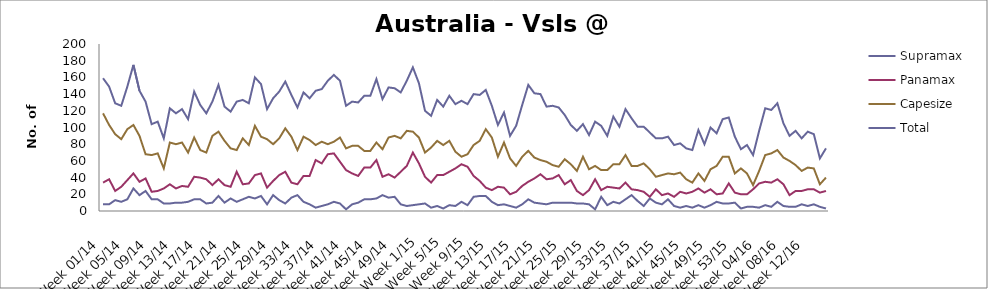
| Category | Supramax | Panamax | Capesize | Total |
|---|---|---|---|---|
| Week 01/14 | 8 | 34 | 117 | 159 |
| Week 02/14 | 8 | 38 | 103 | 149 |
| Week 03/14 | 13 | 24 | 92 | 129 |
| Week 04/14 | 11 | 29 | 86 | 126 |
| Week 05/14 | 14 | 37 | 98 | 149 |
| Week 06/14 | 27 | 45 | 103 | 175 |
| Week 07/14 | 19 | 35 | 90 | 144 |
| Week 08/14 | 24 | 39 | 68 | 131 |
| Week 09/14 | 14 | 23 | 67 | 104 |
| Week 10/14 | 14 | 24 | 69 | 107 |
| Week 11/14 | 9 | 27 | 51 | 87 |
| Week 12/14 | 9 | 32 | 82 | 123 |
| Week 13/14 | 10 | 27 | 80 | 117 |
| Week 14/14 | 10 | 30 | 82 | 122 |
| Week 15/14 | 11 | 29 | 70 | 110 |
| Week 16/14 | 14 | 41 | 88 | 143 |
| Week 17/14 | 14 | 40 | 73 | 127 |
| Week 18/14 | 9 | 38 | 70 | 117 |
| Week 19/14 | 10 | 31 | 90 | 131 |
| Week 20/14 | 18 | 38 | 95 | 151 |
| Week 21/14 | 10 | 31 | 84 | 125 |
| Week 22/14 | 15 | 29 | 75 | 119 |
| Week 23/14 | 11 | 47 | 73 | 131 |
| Week 24/14 | 14 | 32 | 87 | 133 |
| Week 25/14 | 17 | 33 | 79 | 129 |
| Week 26/14 | 15 | 43 | 102 | 160 |
| Week 27/14 | 18 | 45 | 89 | 152 |
| Week 28/14 | 8 | 28 | 86 | 122 |
| Week 29/14 | 19 | 36 | 80 | 135 |
| Week 30/14 | 13 | 43 | 87 | 143 |
| Week 31/14 | 9 | 47 | 99 | 155 |
| Week 32/14 | 16 | 34 | 89 | 139 |
| Week 33/14 | 19 | 32 | 73 | 124 |
| Week 34/14 | 11 | 42 | 89 | 142 |
| Week 35/14 | 8 | 42 | 85 | 135 |
| Week 36/14 | 4 | 61 | 79 | 144 |
| Week 37/14 | 6 | 57 | 83 | 146 |
| Week 38/14 | 8 | 68 | 80 | 156 |
| Week 39/14 | 11 | 69 | 83 | 163 |
| Week 40/14 | 9 | 59 | 88 | 156 |
| Week 41/14 | 2 | 49 | 75 | 126 |
| Week 42/14 | 8 | 45 | 78 | 131 |
| Week 43/14 | 10 | 42 | 78 | 130 |
| Week 44/14 | 14 | 52 | 72 | 138 |
| Week 45/14 | 14 | 52 | 72 | 138 |
| Week 46/14 | 15 | 61 | 82 | 158 |
| Week 47/14 | 19 | 41 | 74 | 134 |
| Week 48/14 | 16 | 44 | 88 | 148 |
| Week 49/14 | 17 | 40 | 90 | 147 |
| Week 50/14 | 8 | 47 | 87 | 142 |
| Week 51/14 | 6 | 54 | 96 | 156 |
| Week 52/14 | 7 | 70 | 95 | 172 |
| Week 1/15 | 8 | 57 | 88 | 153 |
| Week 2/15 | 9 | 41 | 70 | 120 |
| Week 3/15 | 4 | 34 | 76 | 114 |
| Week 4/15 | 6 | 43 | 84 | 133 |
| Week 5/15 | 3 | 43 | 79 | 125 |
| Week 6/15 | 7 | 47 | 84 | 138 |
| Week 7/15 | 6 | 51 | 71 | 128 |
| Week 8/15 | 11 | 56 | 65 | 132 |
| Week 9/15 | 7 | 53 | 68 | 128 |
| Week 10/15 | 17 | 42 | 79 | 140 |
| Week 11/15 | 18 | 36 | 84 | 139 |
| Week 12/15 | 18 | 28 | 98 | 145 |
| Week 13/15 | 11 | 25 | 88 | 126 |
| Week 14/15 | 7 | 29 | 65 | 103 |
| Week 15/15 | 8 | 28 | 82 | 118 |
| Week 16/15 | 6 | 20 | 63 | 90 |
| Week 17/15 | 4 | 23 | 54 | 102 |
| Week 18/15 | 8 | 30 | 65 | 127 |
| Week 19/15 | 14 | 35 | 72 | 151 |
| Week 20/15 | 10 | 39 | 64 | 141 |
| Week 21/15 | 9 | 44 | 61 | 140 |
| Week 22/15 | 8 | 38 | 59 | 125 |
| Week 23/15 | 10 | 39 | 55 | 126 |
| Week 24/15 | 10 | 43 | 53 | 124 |
| Week 25/15 | 10 | 32 | 62 | 115 |
| Week 26/15 | 10 | 37 | 56 | 103 |
| Week 27/15 | 9 | 24 | 48 | 96 |
| Week 28/15 | 9 | 19 | 65 | 104 |
| Week 29/15 | 8 | 25 | 50 | 91 |
| Week 30/15 | 2 | 38 | 54 | 107 |
| Week 31/15 | 17 | 25 | 49 | 102 |
| Week 32/15 | 7 | 29 | 49 | 90 |
| Week 33/15 | 11 | 28 | 56 | 113 |
| Week 34/15 | 9 | 27 | 56 | 101 |
| Week 35/15 | 14 | 34 | 67 | 122 |
| Week 36/15 | 19 | 26 | 54 | 111 |
| Week 37/15 | 12 | 25 | 54 | 101 |
| Week 38/15 | 6 | 23 | 57 | 101 |
| Week 39/15 | 15 | 17 | 50 | 94 |
| Week 40/15 | 10 | 26 | 41 | 87 |
| Week 41/15 | 8 | 19 | 43 | 87 |
| Week 42/15 | 14 | 21 | 45 | 89 |
| Week 43/15 | 6 | 17 | 44 | 79 |
| Week 44/15 | 4 | 23 | 46 | 81 |
| Week 45/15 | 6 | 21 | 38 | 75 |
| Week 46/15 | 4 | 23 | 34 | 73 |
| Week 47/15 | 7 | 27 | 45 | 97 |
| Week 48/15 | 4 | 22 | 36 | 80 |
| Week 49/15 | 7 | 26 | 50 | 100 |
| Week 50/15 | 11 | 20 | 54 | 93 |
| Week 51/15 | 9 | 21 | 65 | 110 |
| Week 52/15 | 9 | 33 | 65 | 112 |
| Week 53/15 | 10 | 22 | 45 | 89 |
| Week 01/16 | 3 | 20 | 51 | 74 |
| Week 02/16 | 5 | 20 | 45 | 79 |
| Week 03/16 | 5 | 26 | 31 | 67 |
| Week 04/16 | 4 | 33 | 48 | 96 |
| Week 05/16 | 7 | 35 | 67 | 123 |
| Week 06/16 | 5 | 34 | 69 | 121 |
| Week 07/16 | 11 | 38 | 73 | 129 |
| Week 08/16 | 6 | 32 | 64 | 105 |
| Week 09/16 | 5 | 19 | 60 | 90 |
| Week 10/16 | 5 | 24 | 55 | 96 |
| Week 11/16 | 8 | 24 | 48 | 87 |
| Week 12/16 | 6 | 26 | 52 | 95 |
| Week 13/16 | 8 | 26 | 51 | 92 |
| Week 14/16 | 5 | 22 | 32 | 63 |